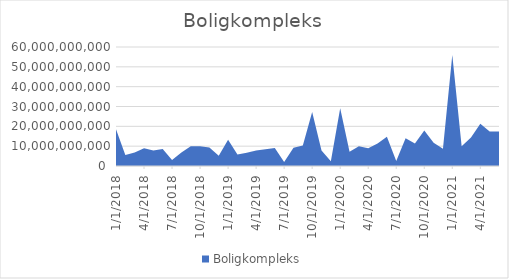
| Category | Boligkompleks |
|---|---|
| 1/1/18 | 18587675005 |
| 2/1/18 | 5566400000 |
| 3/1/18 | 6821510000 |
| 4/1/18 | 8984880000 |
| 5/1/18 | 7799390000 |
| 6/1/18 | 8594925000 |
| 7/1/18 | 3068350000 |
| 8/1/18 | 6778100000 |
| 9/1/18 | 9959730000 |
| 10/1/18 | 9970550000 |
| 11/1/18 | 9329150000 |
| 12/1/18 | 5146700000 |
| 1/1/19 | 13236300000 |
| 2/1/19 | 5847600000 |
| 3/1/19 | 6697450000 |
| 4/1/19 | 7784100000 |
| 5/1/19 | 8422600000 |
| 6/1/19 | 9132700000 |
| 7/1/19 | 2030400000 |
| 8/1/19 | 9173750000 |
| 9/1/19 | 10283500000 |
| 10/1/19 | 27267100000 |
| 11/1/19 | 7847450000 |
| 12/1/19 | 2401500000 |
| 1/1/20 | 29096100000 |
| 2/1/20 | 7178200000 |
| 3/1/20 | 9984600000 |
| 4/1/20 | 8930700000 |
| 5/1/20 | 11314860000 |
| 6/1/20 | 14698700000 |
| 7/1/20 | 2540100000 |
| 8/1/20 | 14046000000 |
| 9/1/20 | 11289150000 |
| 10/1/20 | 17951300000 |
| 11/1/20 | 11715400000 |
| 12/1/20 | 8707900000 |
| 1/1/21 | 55930500000 |
| 2/1/21 | 9943750000 |
| 3/1/21 | 14419200000 |
| 4/1/21 | 21246900000 |
| 5/1/21 | 17376750000 |
| 6/1/21 | 17399700000 |